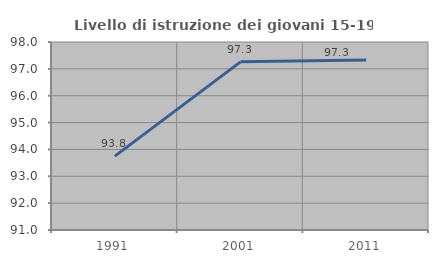
| Category | Livello di istruzione dei giovani 15-19 anni |
|---|---|
| 1991.0 | 93.75 |
| 2001.0 | 97.26 |
| 2011.0 | 97.333 |